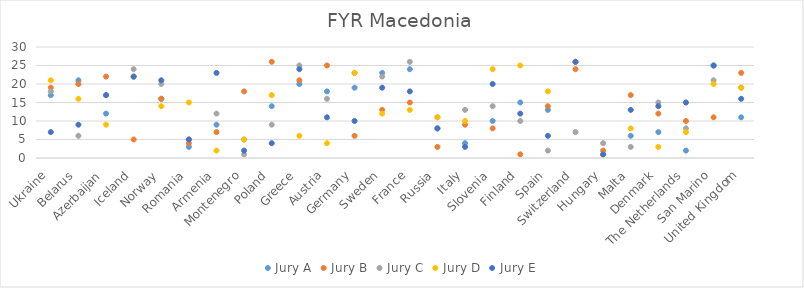
| Category | Jury A | Jury B | Jury C | Jury D | Jury E |
|---|---|---|---|---|---|
| Ukraine | 17 | 19 | 18 | 21 | 7 |
| Belarus | 21 | 20 | 6 | 16 | 9 |
| Azerbaijan | 12 | 22 | 17 | 9 | 17 |
| Iceland | 22 | 5 | 24 | 22 | 22 |
| Norway | 16 | 16 | 20 | 14 | 21 |
| Romania | 3 | 4 | 5 | 15 | 5 |
| Armenia | 9 | 7 | 12 | 2 | 23 |
| Montenegro | 5 | 18 | 1 | 5 | 2 |
| Poland | 14 | 26 | 9 | 17 | 4 |
| Greece | 20 | 21 | 25 | 6 | 24 |
| Austria | 18 | 25 | 16 | 4 | 11 |
| Germany | 19 | 6 | 23 | 23 | 10 |
| Sweden | 23 | 13 | 22 | 12 | 19 |
| France | 24 | 15 | 26 | 13 | 18 |
| Russia | 8 | 3 | 11 | 11 | 8 |
| Italy | 4 | 9 | 13 | 10 | 3 |
| Slovenia | 10 | 8 | 14 | 24 | 20 |
| Finland | 15 | 1 | 10 | 25 | 12 |
| Spain | 13 | 14 | 2 | 18 | 6 |
| Switzerland | 26 | 24 | 7 | 26 | 26 |
| Hungary | 1 | 2 | 4 | 1 | 1 |
| Malta | 6 | 17 | 3 | 8 | 13 |
| Denmark | 7 | 12 | 15 | 3 | 14 |
| The Netherlands | 2 | 10 | 8 | 7 | 15 |
| San Marino | 25 | 11 | 21 | 20 | 25 |
| United Kingdom | 11 | 23 | 19 | 19 | 16 |